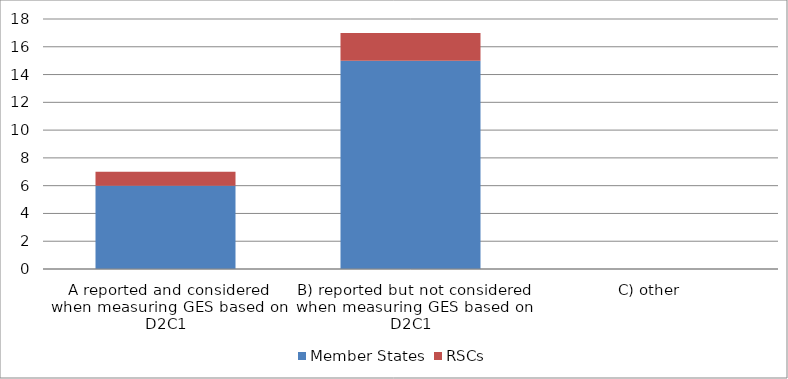
| Category | Member States | RSCs |
|---|---|---|
| A reported and considered when measuring GES based on D2C1 | 6 | 1 |
| B) reported but not considered when measuring GES based on D2C1 | 15 | 2 |
| C) other   | 0 | 0 |